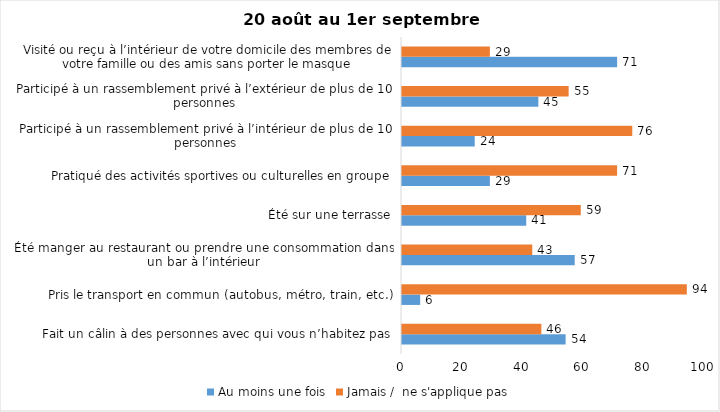
| Category | Au moins une fois | Jamais /  ne s'applique pas |
|---|---|---|
| Fait un câlin à des personnes avec qui vous n’habitez pas | 54 | 46 |
| Pris le transport en commun (autobus, métro, train, etc.) | 6 | 94 |
| Été manger au restaurant ou prendre une consommation dans un bar à l’intérieur | 57 | 43 |
| Été sur une terrasse | 41 | 59 |
| Pratiqué des activités sportives ou culturelles en groupe | 29 | 71 |
| Participé à un rassemblement privé à l’intérieur de plus de 10 personnes | 24 | 76 |
| Participé à un rassemblement privé à l’extérieur de plus de 10 personnes | 45 | 55 |
| Visité ou reçu à l’intérieur de votre domicile des membres de votre famille ou des amis sans porter le masque | 71 | 29 |